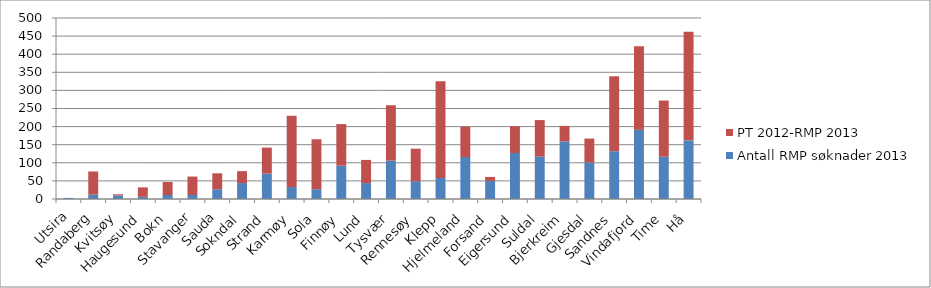
| Category | Antall RMP søknader 2013 | PT 2012-RMP 2013 |
|---|---|---|
| Utsira | 3 | 0 |
| Randaberg | 12 | 64 |
| Kvitsøy | 10 | 3 |
| Haugesund | 6 | 26 |
| Bokn | 11 | 36 |
| Stavanger | 11 | 51 |
| Sauda | 27 | 44 |
| Sokndal | 44 | 33 |
| Strand | 70 | 72 |
| Karmøy | 33 | 197 |
| Sola | 27 | 138 |
| Finnøy | 92 | 115 |
| Lund | 44 | 64 |
| Tysvær | 106 | 153 |
| Rennesøy | 49 | 90 |
| Klepp | 58 | 267 |
| Hjelmeland | 116 | 84 |
| Forsand | 50 | 11 |
| Eigersund | 127 | 74 |
| Suldal | 117 | 101 |
| Bjerkreim | 159 | 43 |
| Gjesdal | 101 | 66 |
| Sandnes | 132 | 207 |
| Vindafjord | 191 | 231 |
| Time | 117 | 155 |
| Hå | 162 | 300 |